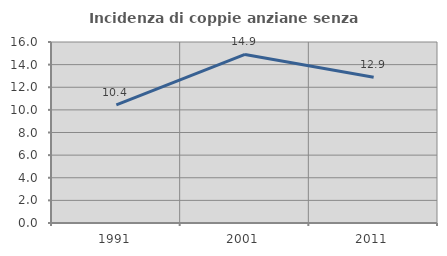
| Category | Incidenza di coppie anziane senza figli  |
|---|---|
| 1991.0 | 10.436 |
| 2001.0 | 14.903 |
| 2011.0 | 12.887 |